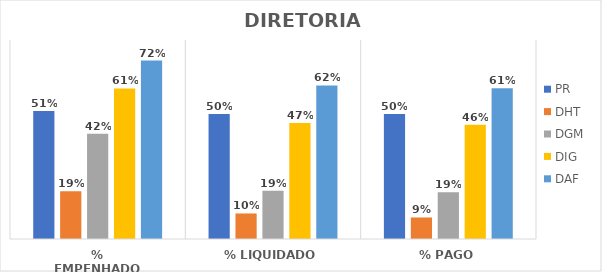
| Category | PR | DHT | DGM | DIG | DAF |
|---|---|---|---|---|---|
| % EMPENHADO | 0.515 | 0.192 | 0.423 | 0.605 | 0.718 |
| % LIQUIDADO | 0.503 | 0.103 | 0.194 | 0.467 | 0.617 |
| % PAGO | 0.503 | 0.087 | 0.188 | 0.459 | 0.606 |